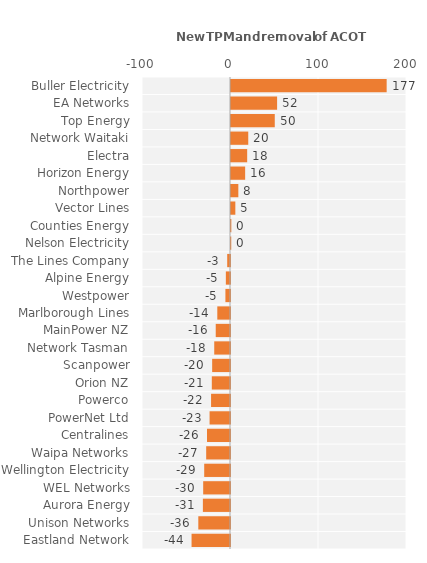
| Category | Series 0 |
|---|---|
| Eastland Network | -43.683 |
| Unison Networks | -36.011 |
| Aurora Energy | -30.824 |
| WEL Networks | -30.474 |
| Wellington Electricity | -29.318 |
| Waipa Networks | -27.066 |
| Centralines | -26.113 |
| PowerNet Ltd | -23.205 |
| Powerco | -21.519 |
| Orion NZ | -20.674 |
| Scanpower | -20.275 |
| Network Tasman | -17.919 |
| MainPower NZ | -16.215 |
| Marlborough Lines | -14.431 |
| Westpower | -5.21 |
| Alpine Energy | -4.719 |
| The Lines Company | -3.175 |
| Nelson Electricity | 0.28 |
| Counties Energy | 0.376 |
| Vector Lines | 4.931 |
| Northpower | 8.335 |
| Horizon Energy | 16.081 |
| Electra | 18.39 |
| Network Waitaki | 19.609 |
| Top Energy | 49.735 |
| EA Networks | 52.387 |
| Buller Electricity | 176.885 |